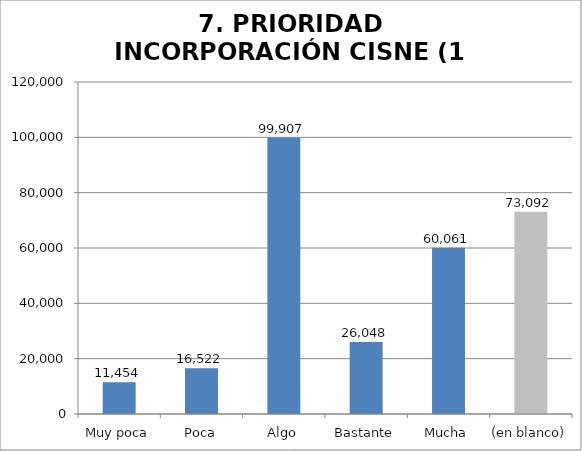
| Category | Series 0 |
|---|---|
| Muy poca | 11454 |
| Poca | 16522 |
| Algo | 99907 |
| Bastante | 26048 |
| Mucha | 60061 |
| (en blanco) | 73092 |